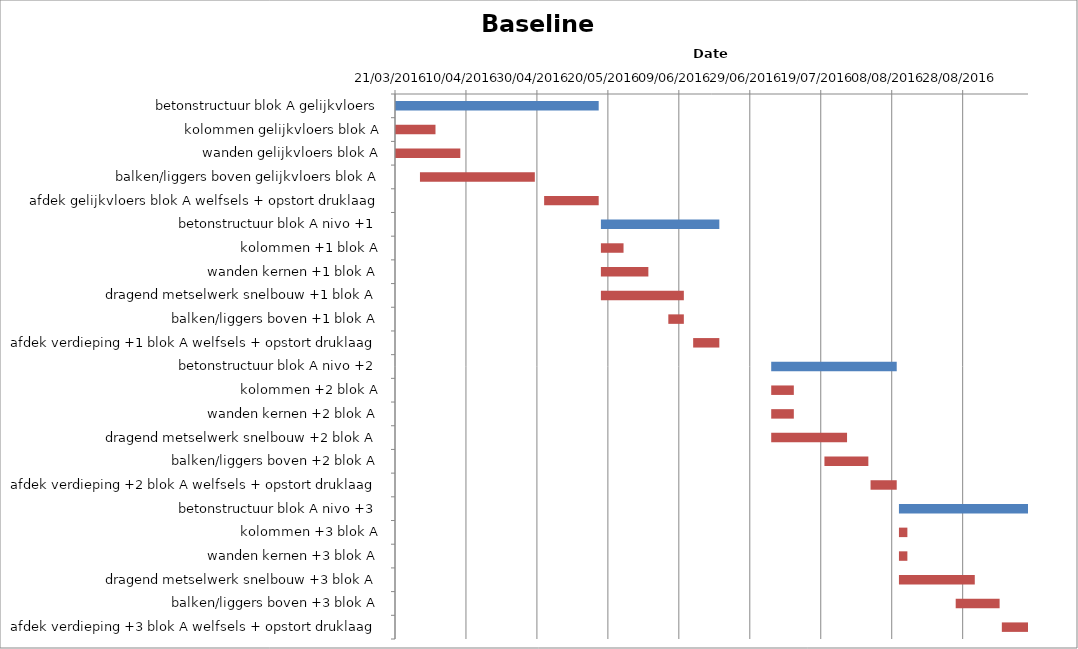
| Category | Baseline start | Actual duration |
|---|---|---|
| betonstructuur blok A gelijkvloers | 42450.333 | 57.375 |
| kolommen gelijkvloers blok A | 42450.333 | 11.375 |
| wanden gelijkvloers blok A | 42450.333 | 18.375 |
| balken/liggers boven gelijkvloers blok A | 42457.333 | 32.375 |
| afdek gelijkvloers blok A welfsels + opstort druklaag | 42492.333 | 15.375 |
| betonstructuur blok A nivo +1 | 42508.333 | 33.375 |
| kolommen +1 blok A | 42508.333 | 6.375 |
| wanden kernen +1 blok A | 42508.333 | 13.375 |
| dragend metselwerk snelbouw +1 blok A | 42508.333 | 23.375 |
| balken/liggers boven +1 blok A | 42527.333 | 4.375 |
| afdek verdieping +1 blok A welfsels + opstort druklaag | 42534.333 | 7.375 |
| betonstructuur blok A nivo +2 | 42556.333 | 35.375 |
| kolommen +2 blok A | 42556.333 | 6.375 |
| wanden kernen +2 blok A | 42556.333 | 6.375 |
| dragend metselwerk snelbouw +2 blok A | 42556.333 | 21.375 |
| balken/liggers boven +2 blok A | 42571.333 | 12.375 |
| afdek verdieping +2 blok A welfsels + opstort druklaag | 42584.333 | 7.375 |
| betonstructuur blok A nivo +3 | 42592.333 | 36.375 |
| kolommen +3 blok A | 42592.333 | 2.375 |
| wanden kernen +3 blok A | 42592.333 | 2.375 |
| dragend metselwerk snelbouw +3 blok A | 42592.333 | 21.375 |
| balken/liggers boven +3 blok A | 42608.333 | 12.375 |
| afdek verdieping +3 blok A welfsels + opstort druklaag | 42621.333 | 7.375 |